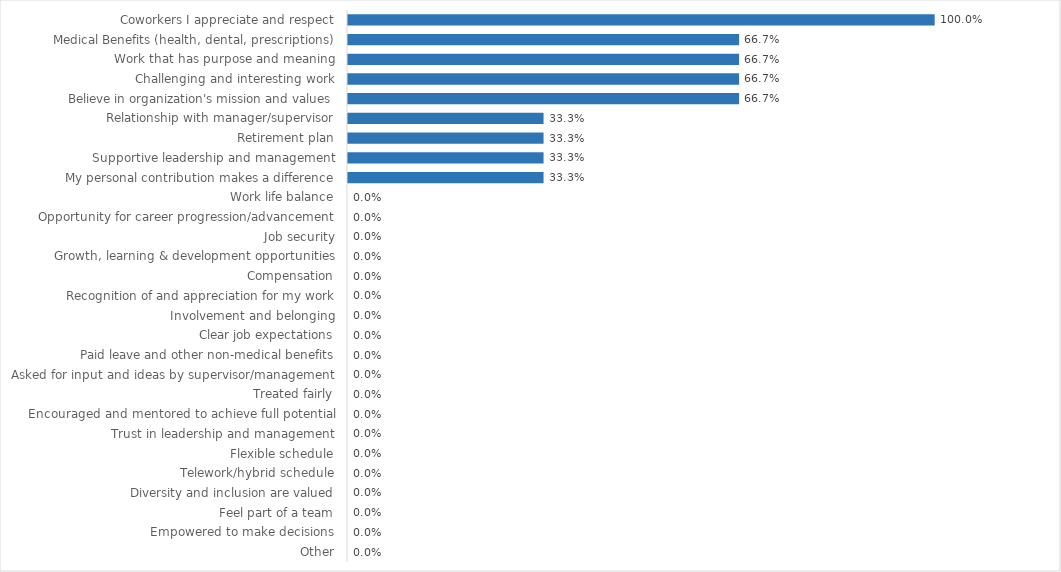
| Category | Governor's Office |
|---|---|
| Coworkers I appreciate and respect | 1 |
| Medical Benefits (health, dental, prescriptions) | 0.667 |
| Work that has purpose and meaning | 0.667 |
| Challenging and interesting work | 0.667 |
| Believe in organization's mission and values | 0.667 |
| Relationship with manager/supervisor | 0.333 |
| Retirement plan | 0.333 |
| Supportive leadership and management | 0.333 |
| My personal contribution makes a difference | 0.333 |
| Work life balance | 0 |
| Opportunity for career progression/advancement | 0 |
| Job security | 0 |
| Growth, learning & development opportunities | 0 |
| Compensation | 0 |
| Recognition of and appreciation for my work | 0 |
| Involvement and belonging | 0 |
| Clear job expectations | 0 |
| Paid leave and other non-medical benefits | 0 |
| Asked for input and ideas by supervisor/management | 0 |
| Treated fairly | 0 |
| Encouraged and mentored to achieve full potential | 0 |
| Trust in leadership and management | 0 |
| Flexible schedule | 0 |
| Telework/hybrid schedule | 0 |
| Diversity and inclusion are valued | 0 |
| Feel part of a team | 0 |
| Empowered to make decisions | 0 |
| Other | 0 |